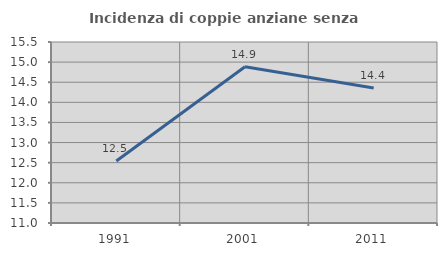
| Category | Incidenza di coppie anziane senza figli  |
|---|---|
| 1991.0 | 12.54 |
| 2001.0 | 14.887 |
| 2011.0 | 14.357 |